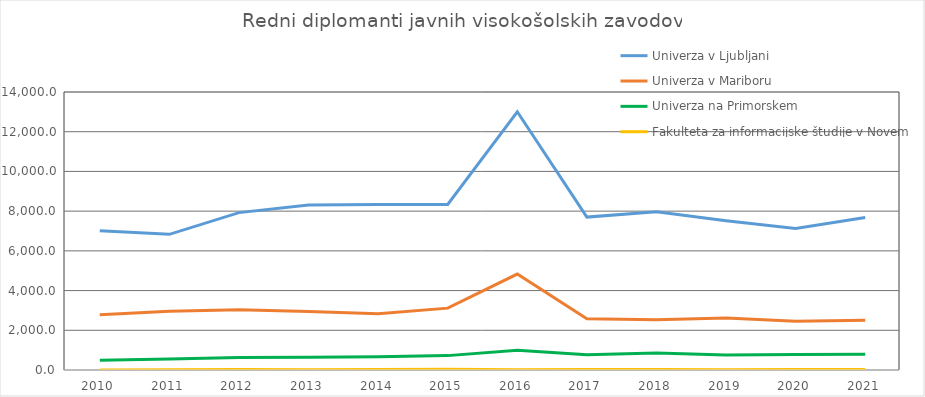
| Category | Univerza v Ljubljani | Univerza v Mariboru | Univerza na Primorskem | Fakulteta za informacijske študije v Novem mestu |
|---|---|---|---|---|
| 2010.0 | 7007 | 2787 | 487 | 5 |
| 2011.0 | 6831.5 | 2963 | 559 | 11 |
| 2012.0 | 7925 | 3031 | 632 | 19 |
| 2013.0 | 8314 | 2948.5 | 638 | 17 |
| 2014.0 | 8329 | 2835.5 | 668 | 27 |
| 2015.0 | 8337 | 3115 | 724 | 33 |
| 2016.0 | 13005.5 | 4831.5 | 993 | 15 |
| 2017.0 | 7701.5 | 2581.5 | 770.5 | 29 |
| 2018.0 | 7963 | 2528.5 | 862 | 26 |
| 2019.0 | 7515.5 | 2622 | 750 | 17 |
| 2020.0 | 7121 | 2450 | 775 | 24 |
| 2021.0 | 7678 | 2506.5 | 794 | 30 |